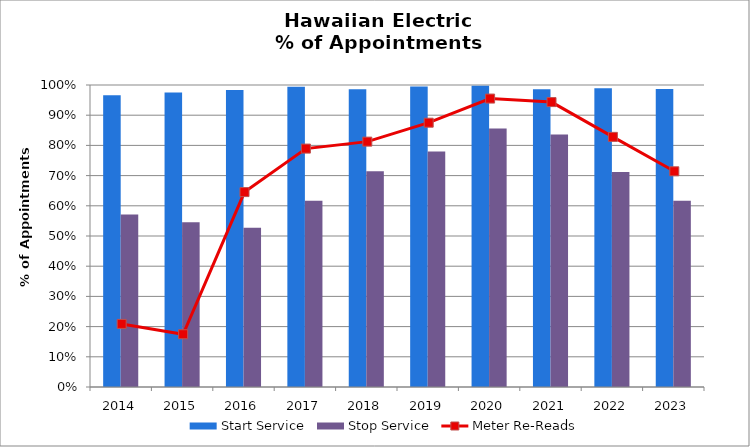
| Category | Start Service | Stop Service |
|---|---|---|
| 2014.0 | 0.966 | 0.571 |
| 2015.0 | 0.976 | 0.546 |
| 2016.0 | 0.984 | 0.527 |
| 2017.0 | 0.994 | 0.617 |
| 2018.0 | 0.986 | 0.715 |
| 2019.0 | 0.995 | 0.78 |
| 2020.0 | 0.997 | 0.856 |
| 2021.0 | 0.986 | 0.836 |
| 2022.0 | 0.989 | 0.712 |
| 2023.0 | 0.987 | 0.617 |